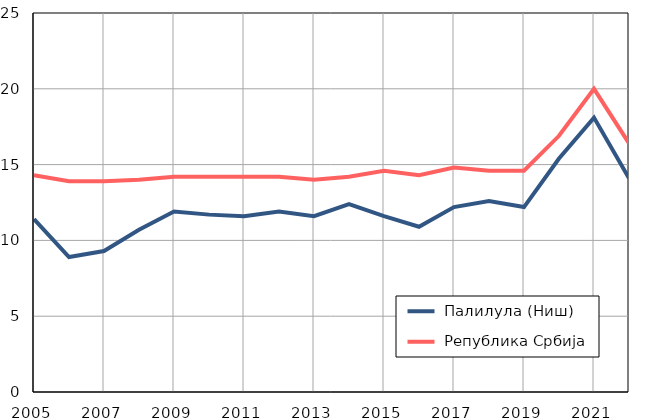
| Category |  Палилула (Ниш) |  Република Србија |
|---|---|---|
| 2005.0 | 11.4 | 14.3 |
| 2006.0 | 8.9 | 13.9 |
| 2007.0 | 9.3 | 13.9 |
| 2008.0 | 10.7 | 14 |
| 2009.0 | 11.9 | 14.2 |
| 2010.0 | 11.7 | 14.2 |
| 2011.0 | 11.6 | 14.2 |
| 2012.0 | 11.9 | 14.2 |
| 2013.0 | 11.6 | 14 |
| 2014.0 | 12.4 | 14.2 |
| 2015.0 | 11.6 | 14.6 |
| 2016.0 | 10.9 | 14.3 |
| 2017.0 | 12.2 | 14.8 |
| 2018.0 | 12.6 | 14.6 |
| 2019.0 | 12.2 | 14.6 |
| 2020.0 | 15.4 | 16.9 |
| 2021.0 | 18.1 | 20 |
| 2022.0 | 14.1 | 16.4 |